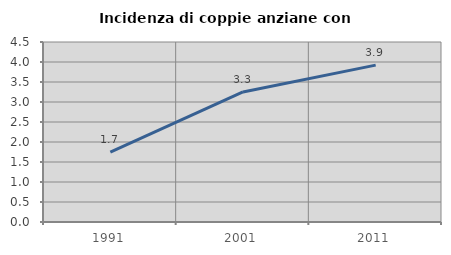
| Category | Incidenza di coppie anziane con figli |
|---|---|
| 1991.0 | 1.748 |
| 2001.0 | 3.251 |
| 2011.0 | 3.922 |